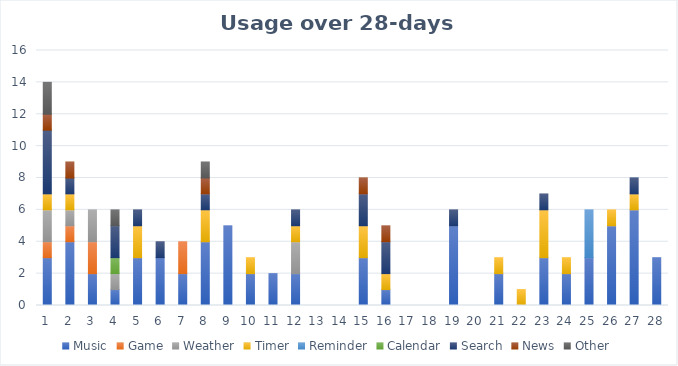
| Category | Music | Game | Weather | Timer | Reminder | Calendar | Search | News | Other |
|---|---|---|---|---|---|---|---|---|---|
| 0 | 3 | 1 | 2 | 1 | 0 | 0 | 4 | 1 | 2 |
| 1 | 4 | 1 | 1 | 1 | 0 | 0 | 1 | 1 | 0 |
| 2 | 2 | 2 | 2 | 0 | 0 | 0 | 0 | 0 | 0 |
| 3 | 1 | 0 | 1 | 0 | 0 | 1 | 2 | 0 | 1 |
| 4 | 3 | 0 | 0 | 2 | 0 | 0 | 1 | 0 | 0 |
| 5 | 3 | 0 | 0 | 0 | 0 | 0 | 1 | 0 | 0 |
| 6 | 2 | 2 | 0 | 0 | 0 | 0 | 0 | 0 | 0 |
| 7 | 4 | 0 | 0 | 2 | 0 | 0 | 1 | 1 | 1 |
| 8 | 5 | 0 | 0 | 0 | 0 | 0 | 0 | 0 | 0 |
| 9 | 2 | 0 | 0 | 1 | 0 | 0 | 0 | 0 | 0 |
| 10 | 2 | 0 | 0 | 0 | 0 | 0 | 0 | 0 | 0 |
| 11 | 2 | 0 | 2 | 1 | 0 | 0 | 1 | 0 | 0 |
| 12 | 0 | 0 | 0 | 0 | 0 | 0 | 0 | 0 | 0 |
| 13 | 0 | 0 | 0 | 0 | 0 | 0 | 0 | 0 | 0 |
| 14 | 3 | 0 | 0 | 2 | 0 | 0 | 2 | 1 | 0 |
| 15 | 1 | 0 | 0 | 1 | 0 | 0 | 2 | 1 | 0 |
| 16 | 0 | 0 | 0 | 0 | 0 | 0 | 0 | 0 | 0 |
| 17 | 0 | 0 | 0 | 0 | 0 | 0 | 0 | 0 | 0 |
| 18 | 5 | 0 | 0 | 0 | 0 | 0 | 1 | 0 | 0 |
| 19 | 0 | 0 | 0 | 0 | 0 | 0 | 0 | 0 | 0 |
| 20 | 2 | 0 | 0 | 1 | 0 | 0 | 0 | 0 | 0 |
| 21 | 0 | 0 | 0 | 1 | 0 | 0 | 0 | 0 | 0 |
| 22 | 3 | 0 | 0 | 3 | 0 | 0 | 1 | 0 | 0 |
| 23 | 2 | 0 | 0 | 1 | 0 | 0 | 0 | 0 | 0 |
| 24 | 3 | 0 | 0 | 0 | 3 | 0 | 0 | 0 | 0 |
| 25 | 5 | 0 | 0 | 1 | 0 | 0 | 0 | 0 | 0 |
| 26 | 6 | 0 | 0 | 1 | 0 | 0 | 1 | 0 | 0 |
| 27 | 3 | 0 | 0 | 0 | 0 | 0 | 0 | 0 | 0 |